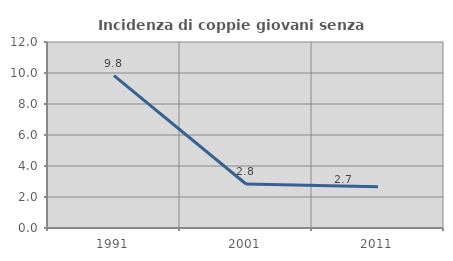
| Category | Incidenza di coppie giovani senza figli |
|---|---|
| 1991.0 | 9.836 |
| 2001.0 | 2.841 |
| 2011.0 | 2.66 |